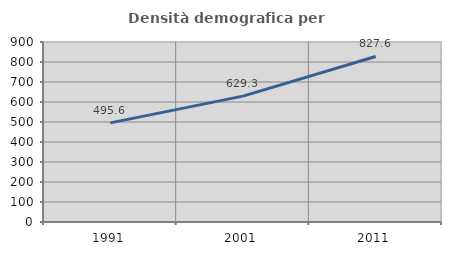
| Category | Densità demografica |
|---|---|
| 1991.0 | 495.635 |
| 2001.0 | 629.315 |
| 2011.0 | 827.63 |